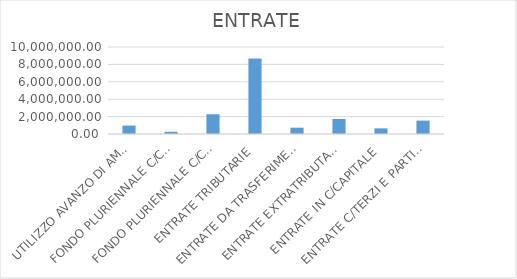
| Category | Series 0 |
|---|---|
| UTILIZZO AVANZO DI AMMINISTRAZIONE | 967404.46 |
| FONDO PLURIENNALE C/CORRENTE | 259364.44 |
| FONDO PLURIENNALE C/CAPITALE | 2266451.86 |
| ENTRATE TRIBUTARIE | 8678881.35 |
| ENTRATE DA TRASFERIMENTI  | 725770.33 |
| ENTRATE EXTRATRIBUTARIE | 1722173.25 |
| ENTRATE IN C/CAPITALE | 653982.71 |
| ENTRATE C/TERZI E PARTITE DI GIRO | 1540143.56 |